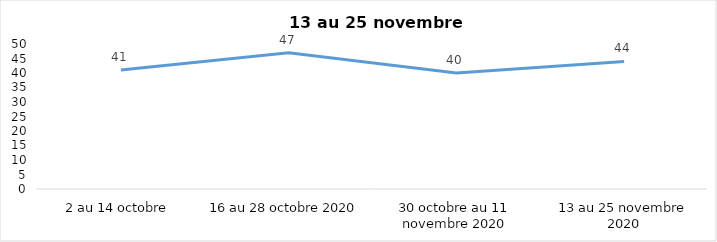
| Category | Series 0 |
|---|---|
| 2 au 14 octobre | 41 |
| 16 au 28 octobre 2020 | 47 |
| 30 octobre au 11 novembre 2020 | 40 |
| 13 au 25 novembre 2020 | 44 |